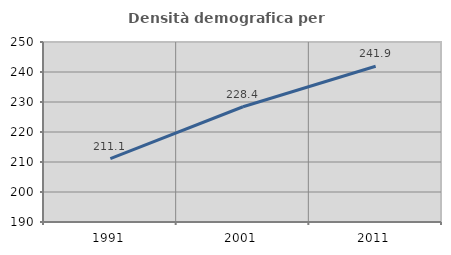
| Category | Densità demografica |
|---|---|
| 1991.0 | 211.12 |
| 2001.0 | 228.422 |
| 2011.0 | 241.913 |